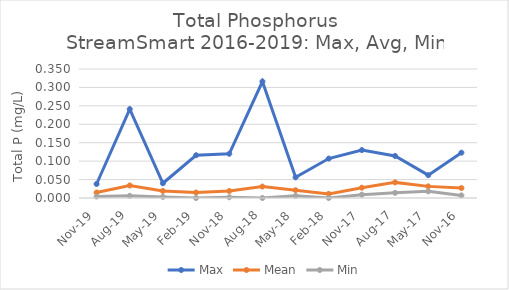
| Category | Max | Mean | Min |
|---|---|---|---|
| 2019-11-01 | 0.038 | 0.015 | 0.004 |
| 2019-08-01 | 0.241 | 0.034 | 0.006 |
| 2019-05-01 | 0.04 | 0.019 | 0.003 |
| 2019-02-01 | 0.116 | 0.015 | 0 |
| 2018-11-01 | 0.12 | 0.019 | 0.002 |
| 2018-08-01 | 0.316 | 0.031 | 0 |
| 2018-05-01 | 0.056 | 0.021 | 0.006 |
| 2018-02-01 | 0.107 | 0.011 | 0 |
| 2017-11-01 | 0.13 | 0.028 | 0.009 |
| 2017-08-01 | 0.114 | 0.042 | 0.014 |
| 2017-05-01 | 0.062 | 0.032 | 0.018 |
| 2016-11-01 | 0.123 | 0.027 | 0.007 |